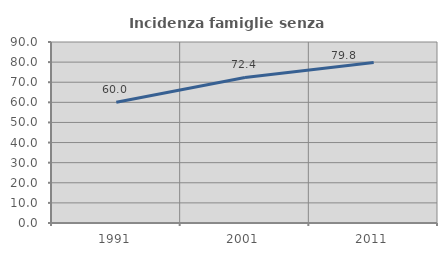
| Category | Incidenza famiglie senza nuclei |
|---|---|
| 1991.0 | 60 |
| 2001.0 | 72.381 |
| 2011.0 | 79.808 |